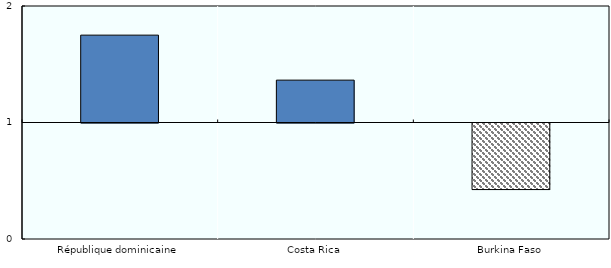
| Category | Ratio |
|---|---|
| République dominicaine | 1.75 |
| Costa Rica | 1.364 |
| Burkina Faso | 0.429 |